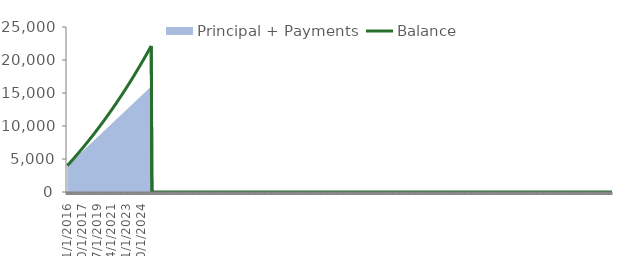
| Category | Balance |
|---|---|
| 1/1/2016 | 4000 |
| 2/1/2016 | 4117.021 |
| 3/1/2016 | 4233.408 |
| 4/1/2016 | 4351.422 |
| 5/1/2016 | 4469.341 |
| 6/1/2016 | 4588.359 |
| 7/1/2016 | 4707.253 |
| 8/1/2016 | 4827.284 |
| 9/1/2016 | 4947.825 |
| 10/1/2016 | 5068.199 |
| 11/1/2016 | 5189.766 |
| 12/1/2016 | 5311.136 |
| 1/1/2017 | 5433.737 |
| 2/1/2017 | 5556.859 |
| 3/1/2017 | 5678.212 |
| 4/1/2017 | 5802.375 |
| 5/1/2017 | 5926.268 |
| 6/1/2017 | 6051.486 |
| 7/1/2017 | 6176.404 |
| 8/1/2017 | 6302.687 |
| 9/1/2017 | 6429.507 |
| 10/1/2017 | 6555.982 |
| 11/1/2017 | 6683.88 |
| 12/1/2017 | 6811.402 |
| 1/1/2018 | 6940.387 |
| 2/1/2018 | 7069.921 |
| 3/1/2018 | 7197.088 |
| 4/1/2018 | 7327.714 |
| 5/1/2018 | 7457.888 |
| 6/1/2018 | 7589.624 |
| 7/1/2018 | 7720.876 |
| 8/1/2018 | 7853.731 |
| 9/1/2018 | 7987.151 |
| 10/1/2018 | 8120.04 |
| 11/1/2018 | 8254.593 |
| 12/1/2018 | 8388.584 |
| 1/1/2019 | 8524.28 |
| 2/1/2019 | 8660.553 |
| 3/1/2019 | 8793.833 |
| 4/1/2019 | 8931.254 |
| 5/1/2019 | 9068.031 |
| 6/1/2019 | 9206.618 |
| 7/1/2019 | 9344.529 |
| 8/1/2019 | 9484.292 |
| 9/1/2019 | 9624.651 |
| 10/1/2019 | 9764.283 |
| 11/1/2019 | 9905.833 |
| 12/1/2019 | 10046.623 |
| 1/1/2020 | 10189.375 |
| 2/1/2020 | 10332.734 |
| 3/1/2020 | 10473.86 |
| 4/1/2020 | 10618.43 |
| 5/1/2020 | 10762.154 |
| 6/1/2020 | 10907.95 |
| 7/1/2020 | 11052.867 |
| 8/1/2020 | 11199.9 |
| 9/1/2020 | 11347.559 |
| 10/1/2020 | 11494.286 |
| 11/1/2020 | 11643.197 |
| 12/1/2020 | 11791.141 |
| 1/1/2021 | 11941.316 |
| 2/1/2021 | 12092.13 |
| 3/1/2021 | 12238.597 |
| 4/1/2021 | 12390.676 |
| 5/1/2021 | 12541.698 |
| 6/1/2021 | 12695.067 |
| 7/1/2021 | 12847.342 |
| 8/1/2021 | 13002.011 |
| 9/1/2021 | 13157.339 |
| 10/1/2021 | 13311.518 |
| 11/1/2021 | 13468.163 |
| 12/1/2021 | 13623.621 |
| 1/1/2022 | 13781.594 |
| 2/1/2022 | 13940.239 |
| 3/1/2022 | 14093.807 |
| 4/1/2022 | 14253.781 |
| 5/1/2022 | 14412.475 |
| 6/1/2022 | 14573.804 |
| 7/1/2022 | 14733.816 |
| 8/1/2022 | 14896.513 |
| 9/1/2022 | 15059.902 |
| 10/1/2022 | 15221.915 |
| 11/1/2022 | 15386.689 |
| 12/1/2022 | 15550.048 |
| 1/1/2023 | 15716.218 |
| 2/1/2023 | 15883.096 |
| 3/1/2023 | 16044.13 |
| 4/1/2023 | 16212.403 |
| 5/1/2023 | 16379.162 |
| 6/1/2023 | 16548.86 |
| 7/1/2023 | 16717.004 |
| 8/1/2023 | 16888.14 |
| 9/1/2023 | 17060.005 |
| 10/1/2023 | 17230.254 |
| 11/1/2023 | 17403.574 |
| 12/1/2023 | 17575.238 |
| 1/1/2024 | 17750.026 |
| 2/1/2024 | 17925.558 |
| 3/1/2024 | 18096.905 |
| 4/1/2024 | 18273.913 |
| 5/1/2024 | 18449.161 |
| 6/1/2024 | 18627.668 |
| 7/1/2024 | 18804.372 |
| 8/1/2024 | 18984.391 |
| 9/1/2024 | 19165.175 |
| 10/1/2024 | 19344.093 |
| 11/1/2024 | 19526.408 |
| 12/1/2024 | 19706.813 |
| 1/1/2025 | 19890.672 |
| 2/1/2025 | 20075.313 |
| 3/1/2025 | 20252.457 |
| 4/1/2025 | 20438.637 |
| 5/1/2025 | 20622.799 |
| 6/1/2025 | 20810.555 |
| 7/1/2025 | 20996.248 |
| 8/1/2025 | 21185.594 |
| 9/1/2025 | 21375.745 |
| 10/1/2025 | 21563.765 |
| 11/1/2025 | 21755.526 |
| 12/1/2025 | 21945.11 |
| 1/1/2026 | 22138.493 |